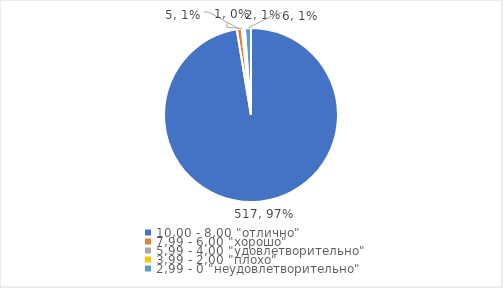
| Category | Series 0 | Series 1 |
|---|---|---|
| 10,00 - 8,00 "отлично" | 517 | 0.974 |
| 7,99 - 6,00 "хорошо" | 5 | 0.009 |
| 5,99 - 4,00 "удовлетворительно" | 1 | 0.002 |
| 3,99 - 2,00 "плохо" | 2 | 0.004 |
| 2,99 - 0 "неудовлетворительно" | 6 | 0.011 |